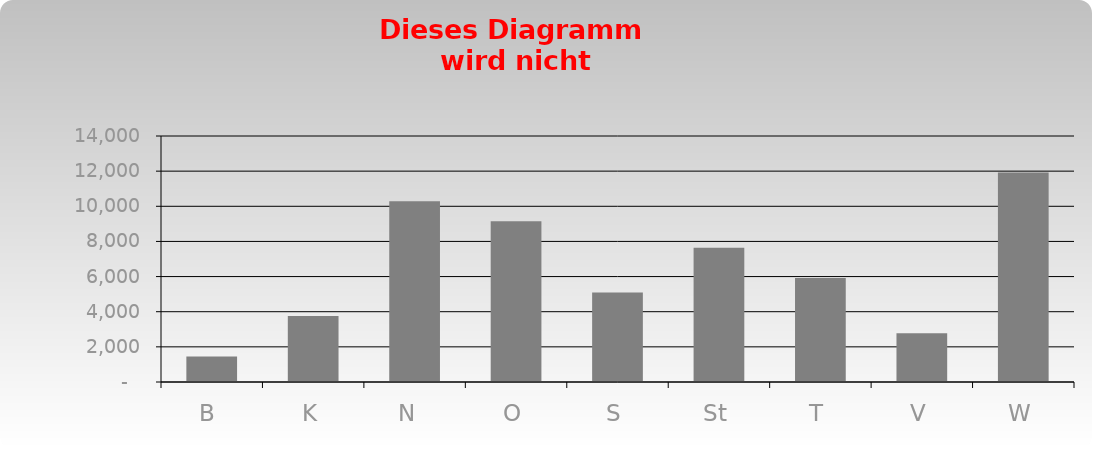
| Category | Series 0 |
|---|---|
| B | 1450 |
| K | 3755 |
| N  | 10282 |
| O | 9148 |
| S | 5093 |
| St | 7641 |
| T | 5925 |
| V | 2769 |
| W | 11921 |